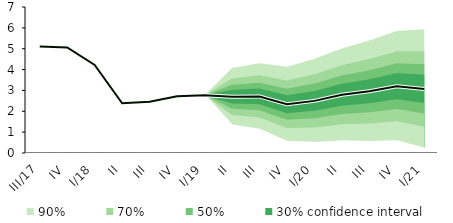
| Category | linka | Střed předpovědi |
|---|---|---|
| III/17 | 5.104 | 5.104 |
| IV | 5.062 | 5.062 |
| I/18 | 4.225 | 4.225 |
| II | 2.383 | 2.383 |
| III | 2.458 | 2.458 |
| IV | 2.722 | 2.722 |
| I/19 | 2.769 | 2.769 |
| II | 2.699 | 2.699 |
| III | 2.712 | 2.712 |
| IV | 2.338 | 2.338 |
| I/20 | 2.499 | 2.499 |
| II | 2.791 | 2.791 |
| III | 2.958 | 2.958 |
| IV | 3.205 | 3.205 |
| I/21 | 3.073 | 3.073 |